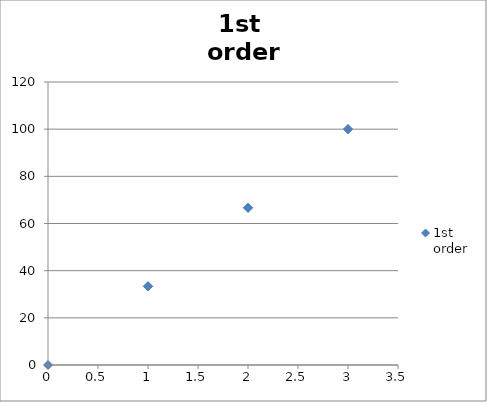
| Category | 1st 
order |
|---|---|
| 3.0 | 100 |
| 1.0 | 33.33 |
| 0.0 | 0 |
| 1.0 | 33.33 |
| 2.0 | 66.67 |
| 3.0 | 100 |
| 1.0 | 33.33 |
| 1.0 | 33.33 |
| 2.0 | 66.67 |
| 1.0 | 33.33 |